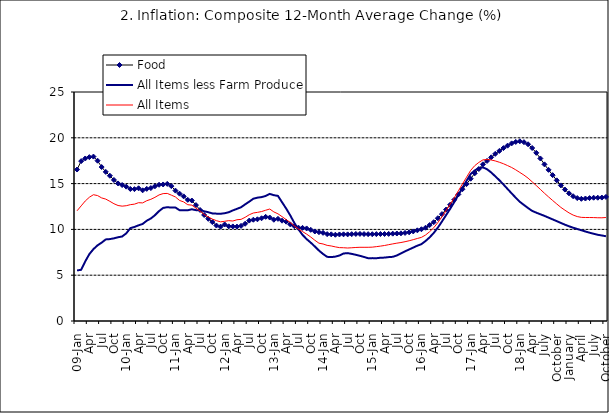
| Category | Food | All Items less Farm Produce | All Items |
|---|---|---|---|
| 09-Jan | 16.536 | 5.519 | 12.032 |
| Feb | 17.454 | 5.591 | 12.567 |
| Mar | 17.742 | 6.51 | 13.101 |
| Apr | 17.89 | 7.302 | 13.51 |
| May | 17.949 | 7.847 | 13.787 |
| June | 17.498 | 8.259 | 13.694 |
| Jul | 16.808 | 8.554 | 13.437 |
| Aug | 16.278 | 8.906 | 13.307 |
| Sep | 15.859 | 8.942 | 13.065 |
| Oct | 15.396 | 9.024 | 12.803 |
| Nov | 15.018 | 9.143 | 12.609 |
| Dec | 14.841 | 9.226 | 12.538 |
| 10-Jan | 14.668 | 9.567 | 12.586 |
| Feb | 14.411 | 10.138 | 12.7 |
| Mar | 14.395 | 10.269 | 12.757 |
| Apr | 14.489 | 10.444 | 12.915 |
| May | 14.266 | 10.597 | 12.893 |
| Jun | 14.424 | 10.948 | 13.132 |
| Jul | 14.514 | 11.193 | 13.284 |
| Aug | 14.706 | 11.549 | 13.5 |
| Sep | 14.872 | 11.997 | 13.764 |
| Oct | 14.906 | 12.345 | 13.908 |
| Nov | 14.967 | 12.423 | 13.928 |
| Dec | 14.723 | 12.383 | 13.74 |
| 11-Jan | 14.233 | 12.385 | 13.542 |
| Feb | 13.903 | 12.099 | 13.161 |
| Mar | 13.606 | 12.077 | 13.001 |
| Apr | 13.227 | 12.088 | 12.694 |
| May | 13.152 | 12.198 | 12.648 |
| Jun | 12.654 | 12.1 | 12.321 |
| Jul | 12.118 | 12.109 | 12.009 |
| Aug | 11.575 | 11.98 | 11.635 |
| Sep | 11.155 | 11.877 | 11.363 |
| Oct | 10.797 | 11.746 | 11.13 |
| Nov | 10.422 | 11.721 | 10.952 |
| Dec | 10.298 | 11.706 | 10.826 |
| 12-Jan | 10.538 | 11.765 | 10.886 |
| 12-Feb | 10.336 | 11.872 | 10.955 |
| 12-Mar | 10.325 | 12.075 | 10.914 |
| Apr | 10.304 | 12.242 | 11.054 |
| May | 10.387 | 12.419 | 11.096 |
| Jun | 10.617 | 12.732 | 11.32 |
| Jul | 10.963 | 13.032 | 11.599 |
| Aug | 11.056 | 13.349 | 11.791 |
| Sep | 11.104 | 13.467 | 11.859 |
| Oct | 11.216 | 13.525 | 11.948 |
| Nov | 11.372 | 13.649 | 12.091 |
| Dec | 11.296 | 13.873 | 12.224 |
| 13-Jan | 11.055 | 13.737 | 11.908 |
| Feb | 11.153 | 13.657 | 11.703 |
| Mar | 10.951 | 12.963 | 11.394 |
| Apr | 10.844 | 12.281 | 11.072 |
| May | 10.548 | 11.531 | 10.761 |
| Jun | 10.352 | 10.704 | 10.383 |
| Jul | 10.186 | 10.005 | 10.047 |
| Aug | 10.168 | 9.4 | 9.761 |
| Sep | 10.105 | 8.939 | 9.486 |
| Oct | 9.955 | 8.553 | 9.167 |
| Nov | 9.774 | 8.136 | 8.815 |
| Dec | 9.695 | 7.691 | 8.496 |
| 14-Jan | 9.626 | 7.317 | 8.408 |
| Feb | 9.484 | 7.005 | 8.257 |
| Mar | 9.464 | 6.976 | 8.19 |
| Apr | 9.416 | 7.03 | 8.092 |
| May | 9.448 | 7.151 | 8.012 |
| Jun | 9.464 | 7.369 | 7.998 |
| Jul | 9.459 | 7.411 | 7.968 |
| Aug | 9.481 | 7.325 | 7.996 |
| Sep | 9.501 | 7.228 | 8.027 |
| Oct | 9.508 | 7.116 | 8.047 |
| Nov | 9.492 | 6.991 | 8.046 |
| Dec | 9.481 | 6.854 | 8.047 |
| 15-Jan | 9.475 | 6.865 | 8.063 |
| Feb | 9.486 | 6.852 | 8.117 |
| Mar | 9.495 | 6.905 | 8.176 |
| Apr | 9.501 | 6.922 | 8.243 |
| May | 9.51 | 6.975 | 8.331 |
| Jun | 9.535 | 7.006 | 8.417 |
| Jul | 9.552 | 7.154 | 8.497 |
| Aug | 9.571 | 7.384 | 8.566 |
| Sep | 9.614 | 7.605 | 8.658 |
| Oct | 9.68 | 7.812 | 8.76 |
| Nov | 9.778 | 8.016 | 8.879 |
| Dec | 9.898 | 8.222 | 9.009 |
| 16-Jan | 10.017 | 8.391 | 9.13 |
| Feb | 10.184 | 8.732 | 9.386 |
| Mar | 10.471 | 9.132 | 9.751 |
| Apr | 10.786 | 9.614 | 10.182 |
| May | 11.221 | 10.196 | 10.746 |
| Jun | 11.672 | 10.864 | 11.372 |
| Jul | 12.162 | 11.553 | 12.045 |
| Aug | 12.696 | 12.247 | 12.744 |
| Sep | 13.238 | 12.98 | 13.454 |
| Oct | 13.817 | 13.757 | 14.206 |
| Nov | 14.386 | 14.542 | 14.958 |
| Dec | 14.946 | 15.307 | 15.697 |
| 17-Jan | 15.536 | 16.042 | 16.441 |
| Feb | 16.127 | 16.436 | 16.958 |
| Mar | 16.598 | 16.682 | 17.315 |
| Apr | 17.106 | 16.772 | 17.591 |
| May | 17.477 | 16.567 | 17.628 |
| Jun | 17.868 | 16.219 | 17.578 |
| Jul | 18.247 | 15.798 | 17.475 |
| Aug | 18.569 | 15.372 | 17.331 |
| Sep | 18.876 | 14.903 | 17.17 |
| Oct | 19.14 | 14.415 | 16.968 |
| Nov | 19.392 | 13.93 | 16.76 |
| Dec | 19.546 | 13.458 | 16.502 |
| 18-Jan | 19.621 | 13.01 | 16.215 |
| Feb | 19.521 | 12.668 | 15.93 |
| Mar | 19.294 | 12.33 | 15.599 |
| Apr | 18.886 | 12.021 | 15.196 |
| May | 18.359 | 11.828 | 14.793 |
| June | 17.745 | 11.651 | 14.371 |
| July | 17.102 | 11.478 | 13.95 |
| August | 16.501 | 11.285 | 13.546 |
| September | 15.923 | 11.092 | 13.157 |
| October | 15.355 | 10.903 | 12.777 |
| November | 14.802 | 10.703 | 12.406 |
| December | 14.348 | 10.514 | 12.095 |
| January | 13.934 | 10.339 | 11.801 |
| February | 13.62 | 10.185 | 11.564 |
| March | 13.42 | 10.044 | 11.401 |
| April | 13.339 | 9.909 | 11.314 |
| May | 13.371 | 9.77 | 11.299 |
| June | 13.418 | 9.64 | 11.297 |
| July | 13.46 | 9.524 | 11.291 |
| August | 13.458 | 9.411 | 11.271 |
| September | 13.474 | 9.337 | 11.268 |
| October | 13.544 | 9.253 | 11.298 |